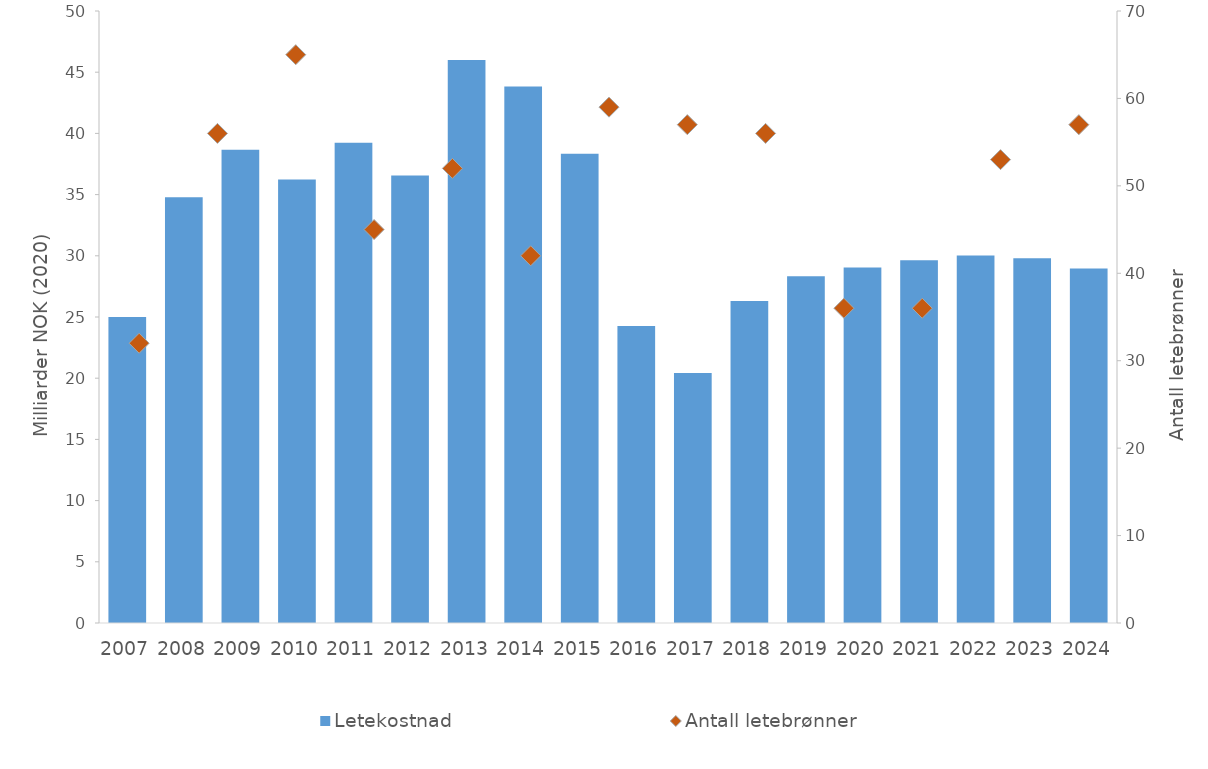
| Category | Letekostnad  |
|---|---|
| 2007.0 | 24.999 |
| 2008.0 | 34.791 |
| 2009.0 | 38.671 |
| 2010.0 | 36.241 |
| 2011.0 | 39.23 |
| 2012.0 | 36.552 |
| 2013.0 | 46.005 |
| 2014.0 | 43.835 |
| 2015.0 | 38.342 |
| 2016.0 | 24.257 |
| 2017.0 | 20.415 |
| 2018.0 | 26.306 |
| 2019.0 | 28.336 |
| 2020.0 | 29.047 |
| 2021.0 | 29.639 |
| 2022.0 | 30.024 |
| 2023.0 | 29.805 |
| 2024.0 | 28.961 |